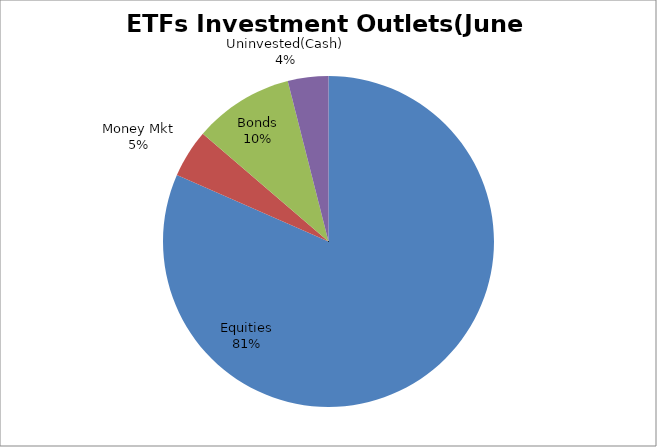
| Category | Series 0 |
|---|---|
| Equities | 3972247152.89 |
| Money Mkt | 229299651.51 |
| Bonds | 475230363.37 |
| Uninvested(Cash) | 192975483.86 |